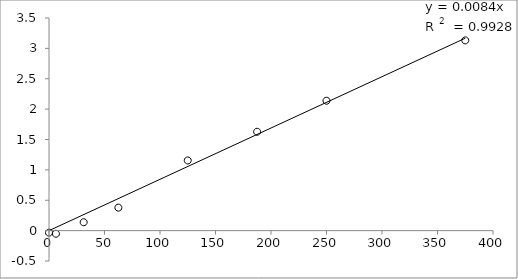
| Category | Series 0 |
|---|---|
| 375.0 | 3.132 |
| 250.0 | 2.138 |
| 187.5 | 1.628 |
| 125.0 | 1.156 |
| 62.5 | 0.378 |
| 31.25 | 0.138 |
| 6.25 | -0.052 |
| 0.0 | -0.033 |